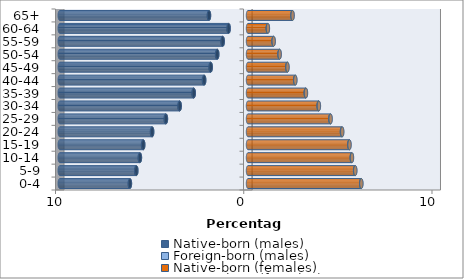
| Category | Native-born (males) | Foreign-born (males) | Native-born (females) | Foreign-born (females) |
|---|---|---|---|---|
| 0-4 | -6.272 | -0.008 | 6.013 | 0.009 |
| 5-9 | -5.932 | -0.009 | 5.689 | 0.011 |
| 10-14 | -5.741 | -0.011 | 5.511 | 0.013 |
| 15-19 | -5.565 | -0.013 | 5.379 | 0.016 |
| 20-24 | -5.091 | -0.014 | 4.99 | 0.018 |
| 25-29 | -4.359 | -0.017 | 4.373 | 0.018 |
| 30-34 | -3.628 | -0.019 | 3.752 | 0.015 |
| 35-39 | -2.88 | -0.019 | 3.068 | 0.013 |
| 40-44 | -2.327 | -0.017 | 2.505 | 0.011 |
| 45-49 | -1.978 | -0.015 | 2.088 | 0.009 |
| 50-54 | -1.633 | -0.012 | 1.673 | 0.007 |
| 55-59 | -1.343 | -0.01 | 1.357 | 0.006 |
| 60-64 | -1.028 | -0.008 | 1.051 | 0.006 |
| 65+ | -2.072 | -0.009 | 2.36 | 0.008 |